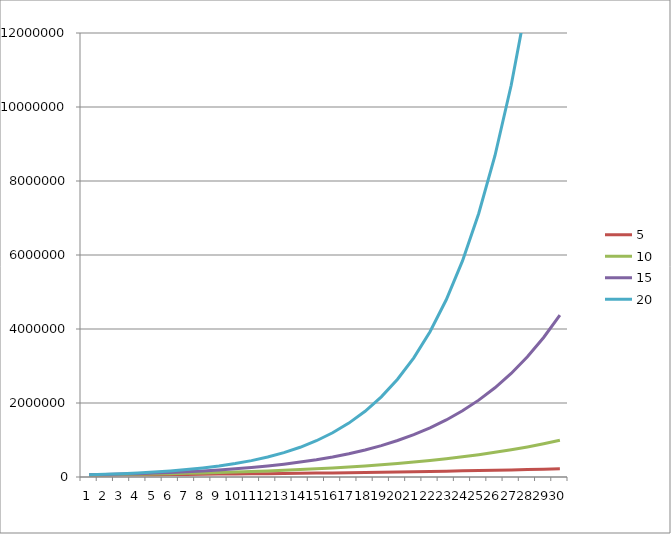
| Category | 5 | 10 | 15 | 20 |
|---|---|---|---|---|
| 0 | 52558.095 | 55235.653 | 58037.726 | 60969.554 |
| 1 | 55247.067 | 61019.548 | 67367.553 | 74345.731 |
| 2 | 58073.612 | 67409.092 | 78197.191 | 90656.521 |
| 3 | 61044.768 | 74467.705 | 90767.743 | 110545.754 |
| 4 | 64167.934 | 82265.447 | 105359.067 | 134798.507 |
| 5 | 67450.887 | 90879.714 | 122296.013 | 164372.098 |
| 6 | 70901.803 | 100396.008 | 141955.65 | 200433.87 |
| 7 | 74529.273 | 110908.782 | 164775.662 | 244407.275 |
| 8 | 78342.332 | 122522.38 | 191264.094 | 298028.052 |
| 9 | 82350.475 | 135352.075 | 222010.661 | 363412.75 |
| 10 | 86563.681 | 149525.205 | 257699.878 | 443142.267 |
| 11 | 90992.444 | 165182.448 | 299126.298 | 540363.73 |
| 12 | 95647.79 | 182479.209 | 347212.202 | 658914.715 |
| 13 | 100541.312 | 201587.167 | 403028.132 | 803474.729 |
| 14 | 105685.197 | 222695.978 | 467816.725 | 979749.921 |
| 15 | 111092.252 | 246015.157 | 543020.377 | 1194698.319 |
| 16 | 116775.942 | 271776.158 | 630313.355 | 1456804.48 |
| 17 | 122750.421 | 300234.673 | 731639.075 | 1776414.395 |
| 18 | 129030.566 | 331673.167 | 849253.361 | 2166143.876 |
| 19 | 135632.014 | 366403.682 | 985774.676 | 2641376.532 |
| 20 | 142571.206 | 404770.935 | 1144242.409 | 3220870.994 |
| 21 | 149865.419 | 447155.741 | 1328184.545 | 3927501.376 |
| 22 | 157532.818 | 493978.791 | 1541696.211 | 4789160.164 |
| 23 | 165592.496 | 545704.825 | 1789530.842 | 5839859.208 |
| 24 | 174064.523 | 602847.251 | 2077206.009 | 7121072.256 |
| 25 | 182969.994 | 665973.236 | 2411126.26 | 8683372.024 |
| 26 | 192331.086 | 735709.336 | 2798725.699 | 10588426.433 |
| 27 | 202171.109 | 812747.718 | 3248633.499 | 12911432.795 |
| 28 | 212514.567 | 897853.024 | 3770866.01 | 15744086.044 |
| 29 | 223387.216 | 991869.969 | 4377049.757 | 19198198.162 |